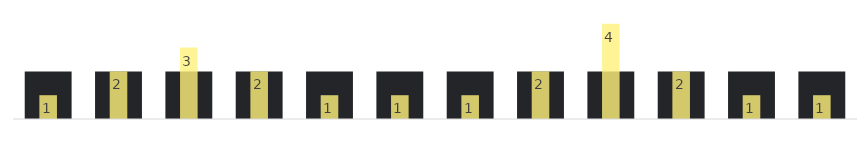
| Category | Summe von Ziel |
|---|---|
| 1 | 2 |
| 2 | 2 |
| 3 | 2 |
| 4 | 2 |
| 5 | 2 |
| 6 | 2 |
| 7 | 2 |
| 8 | 2 |
| 9 | 2 |
| 10 | 2 |
| 11 | 2 |
| 12 | 2 |